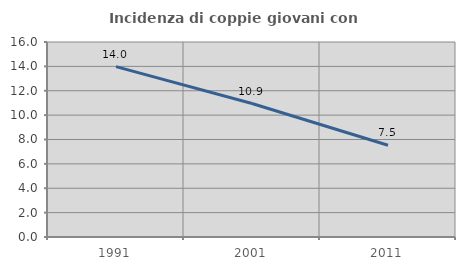
| Category | Incidenza di coppie giovani con figli |
|---|---|
| 1991.0 | 13.983 |
| 2001.0 | 10.95 |
| 2011.0 | 7.528 |